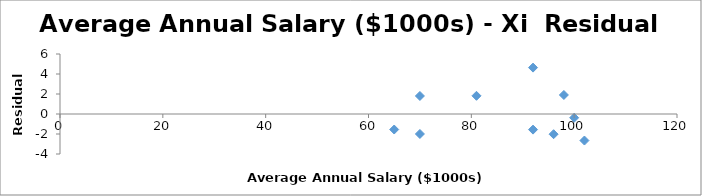
| Category | Series 0 |
|---|---|
| 81.0 | 1.82 |
| 96.0 | -2.019 |
| 70.0 | -1.998 |
| 70.0 | 1.802 |
| 92.0 | -1.562 |
| 92.0 | 4.638 |
| 100.0 | -0.376 |
| 98.0 | 1.902 |
| 102.0 | -2.655 |
| 65.0 | -1.552 |